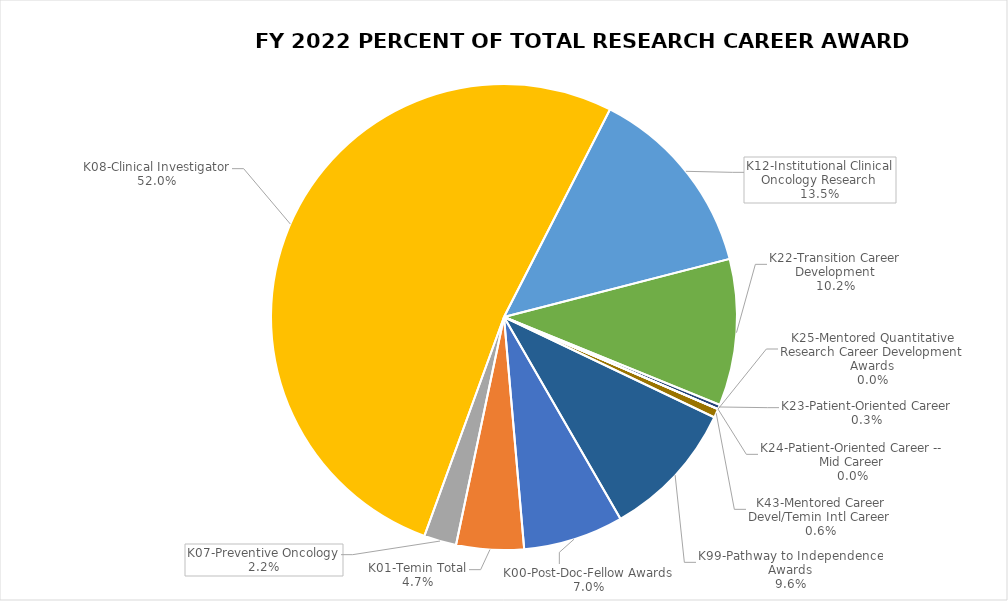
| Category | % of funds | % of awards |
|---|---|---|
| K00-Post-Doc-Fellow Awards | 0.07 | 0.151 |
| K01-Temin Total | 0.047 | 0.054 |
| K07-Preventive Oncology | 0.022 | 0.031 |
| K08-Clinical Investigator | 0.52 | 0.463 |
| K12-Institutional Clinical Oncology Research | 0.135 | 0.041 |
| K22-Transition Career Development | 0.102 | 0.111 |
| K23-Patient-Oriented Career | 0.003 | 0.004 |
| K24-Patient-Oriented Career -- Mid Career | 0 | 0 |
| K25-Mentored Quantitative Research Career Development Awards | 0 | 0 |
| K43-Mentored Career Devel/Temin Intl Career | 0.006 | 0.004 |
| K99-Pathway to Independence Awards | 0.096 | 0.142 |